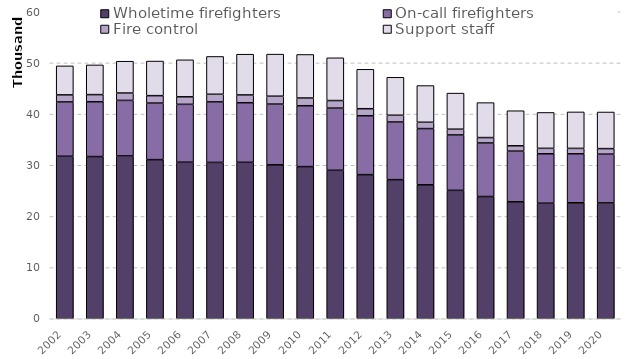
| Category | Wholetime firefighters | On-call firefighters | Fire control | Support staff |
|---|---|---|---|---|
| 2002 | 31761 | 10613 | 1379 | 5669 |
| 2003 | 31699 | 10716 | 1388 | 5807 |
| 2004 | 31826 | 10853 | 1435 | 6220 |
| 2005 | 31097 | 11056 | 1448 | 6762 |
| 2006 | 30596 | 11312 | 1470 | 7231 |
| 2007 | 30558 | 11827 | 1491 | 7390 |
| 2008 | 30580 | 11642 | 1522 | 7959 |
| 2009 | 30088 | 11865 | 1543 | 8224 |
| 2010 | 29735 | 11898 | 1510 | 8509 |
| 2011 | 29018 | 12149 | 1478 | 8358 |
| 2012 | 28166 | 11513 | 1371 | 7704 |
| 2013 | 27185 | 11269 | 1319 | 7419 |
| 2014 | 26180 | 10989 | 1232 | 7175 |
| 2015 | 25098 | 10828 | 1120 | 7056 |
| 2016 | 23887 | 10469 | 1055 | 6829 |
| 2017 | 22867 | 9894 | 1043 | 6852 |
| 2018 | 22580 | 9665 | 1061 | 7014 |
| 2019 | 22670 | 9563 | 1063 | 7128 |
| 2020 | 22638 | 9534 | 1078 | 7159 |